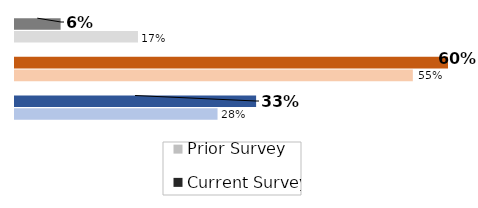
| Category | Prior Survey | Current Survey |
|---|---|---|
| Balanced | 0.28 | 0.333 |
| Downside | 0.55 | 0.604 |
| Upside | 0.17 | 0.063 |